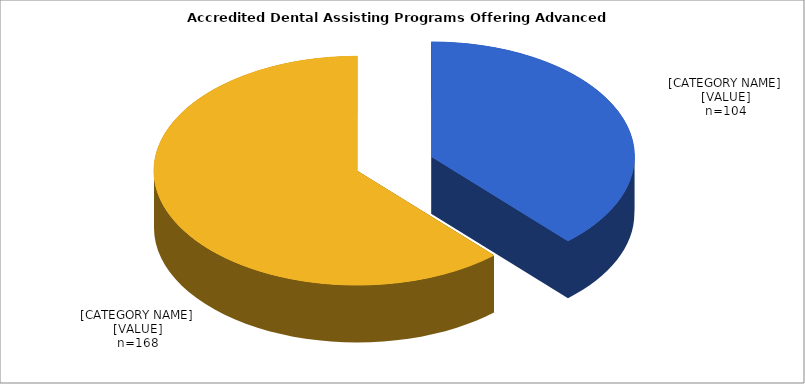
| Category | Series 0 |
|---|---|
| Yes | 0.382 |
| No | 0.618 |